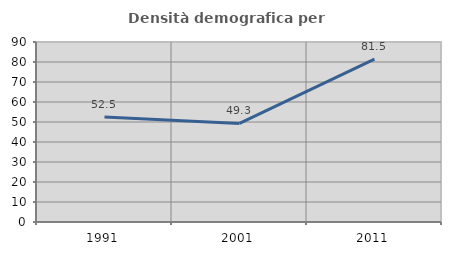
| Category | Densità demografica |
|---|---|
| 1991.0 | 52.501 |
| 2001.0 | 49.281 |
| 2011.0 | 81.482 |